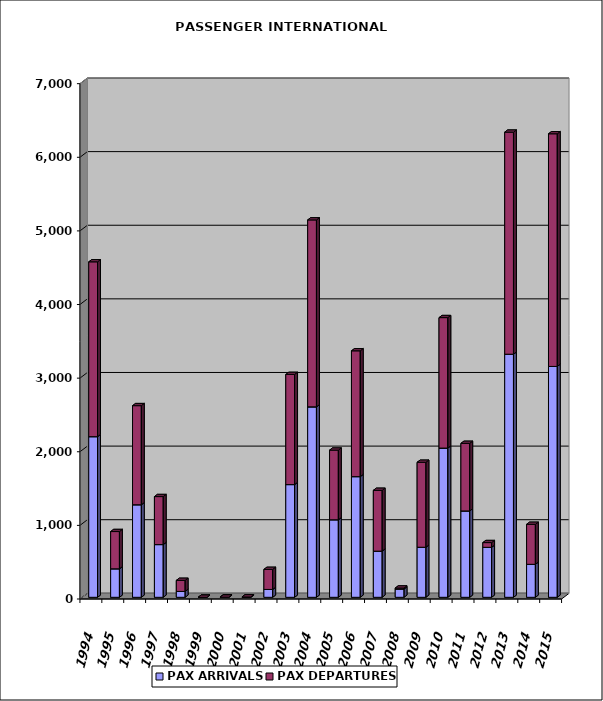
| Category | PAX ARRIVALS | PAX DEPARTURES |
|---|---|---|
| 1994.0 | 2182 | 2375 |
| 1995.0 | 387 | 506 |
| 1996.0 | 1257 | 1346 |
| 1997.0 | 716 | 652 |
| 1998.0 | 80 | 150 |
| 1999.0 | 0 | 0 |
| 2000.0 | 2 | 0 |
| 2001.0 | 0 | 5 |
| 2002.0 | 107 | 272 |
| 2003.0 | 1531 | 1496 |
| 2004.0 | 2587 | 2539 |
| 2005.0 | 1053 | 946 |
| 2006.0 | 1639 | 1709 |
| 2007.0 | 627 | 826 |
| 2008.0 | 113 | 13 |
| 2009.0 | 680 | 1154 |
| 2010.0 | 2027 | 1772 |
| 2011.0 | 1173 | 918 |
| 2012.0 | 679 | 64 |
| 2013.0 | 3302 | 3016 |
| 2014.0 | 448 | 543 |
| 2015.0 | 3136 | 3160 |